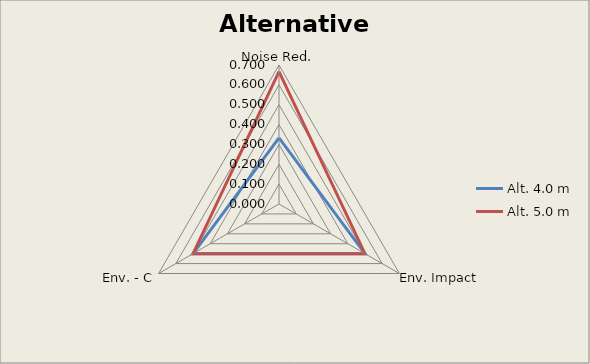
| Category | Alt. 4.0 m | Alt. 5.0 m |
|---|---|---|
| Noise Red. | 0.333 | 0.667 |
| Env. Impact | 0.5 | 0.5 |
| Env. - C | 0.5 | 0.5 |